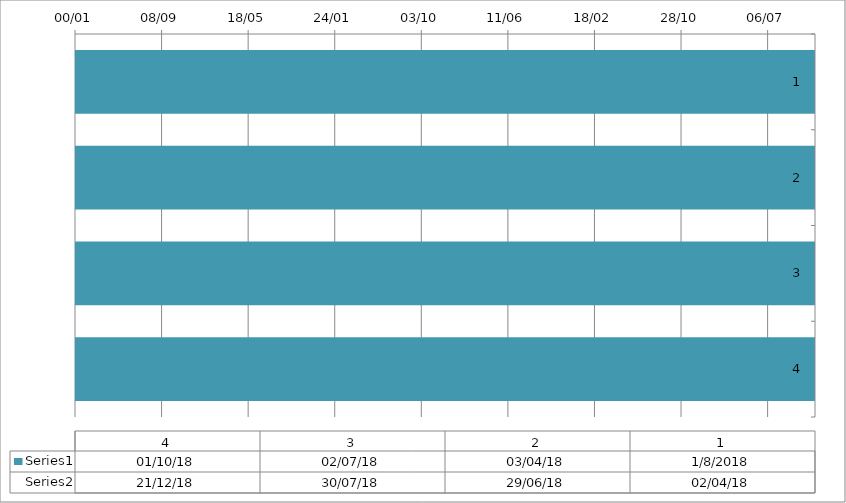
| Category | Series 4 | Series 5 |
|---|---|---|
| 0 | 2018-01-08 | 2018-04-02 |
| 1 | 2018-04-03 | 2018-06-29 |
| 2 | 2018-07-02 | 2018-07-30 |
| 3 | 2018-10-01 | 2018-12-21 |